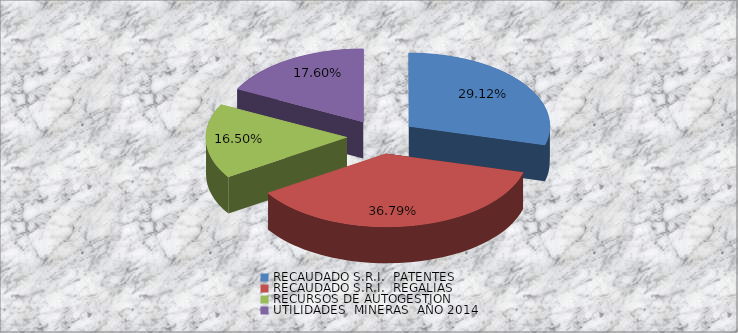
| Category | Series 0 |
|---|---|
| _x001c_RECAUDADO S.R.I.  PATENTES   | 7407084.83 |
| _x001a_RECAUDADO S.R.I.  REGALIAS | 9359220.35 |
| _x0017_RECURSOS DE AUTOGESTION | 4196625.08 |
| _x001d_UTILIDADES  MINERAS  AÑO 2014 | 4477691.24 |